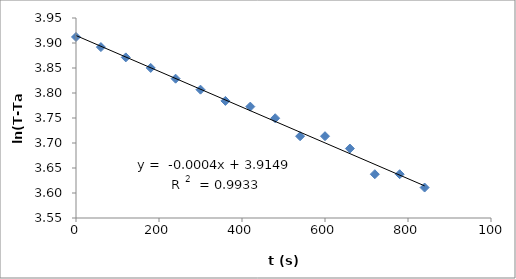
| Category | Series 0 |
|---|---|
| 0.0 | 3.912 |
| 60.0 | 3.892 |
| 120.0 | 3.871 |
| 180.0 | 3.85 |
| 240.0 | 3.829 |
| 300.0 | 3.807 |
| 360.0 | 3.784 |
| 420.0 | 3.773 |
| 480.0 | 3.75 |
| 540.0 | 3.714 |
| 600.0 | 3.714 |
| 660.0 | 3.689 |
| 720.0 | 3.638 |
| 780.0 | 3.638 |
| 840.0 | 3.611 |